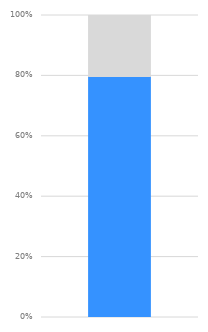
| Category | Series 1 | Series 0 |
|---|---|---|
| 0 | 0.798 | 0.202 |